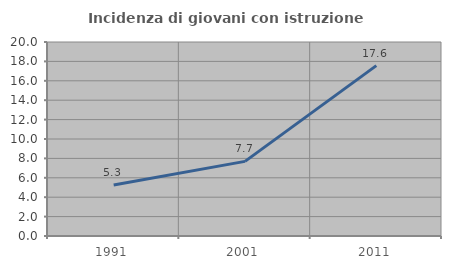
| Category | Incidenza di giovani con istruzione universitaria |
|---|---|
| 1991.0 | 5.263 |
| 2001.0 | 7.692 |
| 2011.0 | 17.568 |